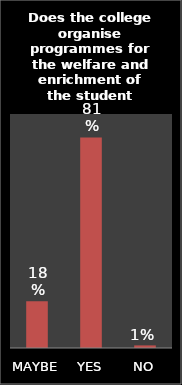
| Category | Series 0 |
|---|---|
| MAYBE | 0.18 |
| YES | 0.81 |
| NO | 0.01 |